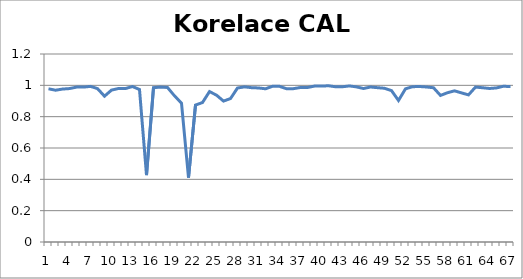
| Category | Korelace CAL 17 |
|---|---|
| 0 | 0.978 |
| 1 | 0.969 |
| 2 | 0.976 |
| 3 | 0.979 |
| 4 | 0.989 |
| 5 | 0.989 |
| 6 | 0.993 |
| 7 | 0.979 |
| 8 | 0.931 |
| 9 | 0.97 |
| 10 | 0.98 |
| 11 | 0.98 |
| 12 | 0.992 |
| 13 | 0.973 |
| 14 | 0.427 |
| 15 | 0.985 |
| 16 | 0.99 |
| 17 | 0.986 |
| 18 | 0.933 |
| 19 | 0.886 |
| 20 | 0.411 |
| 21 | 0.874 |
| 22 | 0.89 |
| 23 | 0.96 |
| 24 | 0.937 |
| 25 | 0.899 |
| 26 | 0.916 |
| 27 | 0.983 |
| 28 | 0.99 |
| 29 | 0.985 |
| 30 | 0.983 |
| 31 | 0.978 |
| 32 | 0.994 |
| 33 | 0.994 |
| 34 | 0.978 |
| 35 | 0.979 |
| 36 | 0.986 |
| 37 | 0.986 |
| 38 | 0.995 |
| 39 | 0.995 |
| 40 | 0.997 |
| 41 | 0.991 |
| 42 | 0.991 |
| 43 | 0.996 |
| 44 | 0.99 |
| 45 | 0.98 |
| 46 | 0.989 |
| 47 | 0.985 |
| 48 | 0.981 |
| 49 | 0.966 |
| 50 | 0.903 |
| 51 | 0.978 |
| 52 | 0.991 |
| 53 | 0.993 |
| 54 | 0.989 |
| 55 | 0.985 |
| 56 | 0.936 |
| 57 | 0.953 |
| 58 | 0.965 |
| 59 | 0.952 |
| 60 | 0.939 |
| 61 | 0.989 |
| 62 | 0.985 |
| 63 | 0.98 |
| 64 | 0.984 |
| 65 | 0.994 |
| 66 | 0.992 |